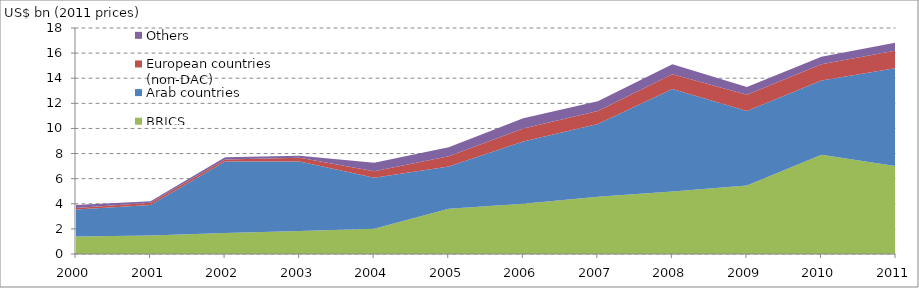
| Category | BRICS | Arab countries | European countries (non-DAC) | Others |
|---|---|---|---|---|
| 2000.0 | 1385.726 | 2159.36 | 127.77 | 224.03 |
| 2001.0 | 1483.248 | 2420.22 | 170.21 | 127.77 |
| 2002.0 | 1671.647 | 5687.15 | 159.35 | 195.7 |
| 2003.0 | 1824.006 | 5547.58 | 290.04 | 161.22 |
| 2004.0 | 2019.666 | 4052.17 | 528.56 | 672.34 |
| 2005.0 | 3611.569 | 3362.3 | 802.39 | 720.97 |
| 2006.0 | 3995.52 | 4958.01 | 1034.24 | 820.6 |
| 2007.0 | 4550.567 | 5809.43 | 1026.32 | 779.92 |
| 2008.0 | 4976.577 | 8165.83 | 1176.15 | 791.25 |
| 2009.0 | 5453.747 | 5934.63 | 1291.19 | 627.29 |
| 2010.0 | 7895.792 | 5931.6 | 1278.36 | 608.85 |
| 2011.0 | 6992.569 | 7823.33 | 1384.87 | 637.4 |